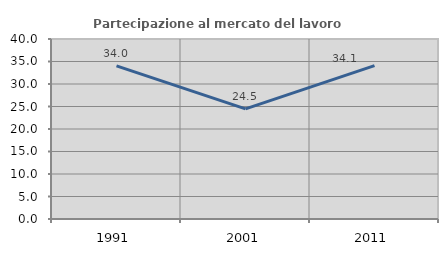
| Category | Partecipazione al mercato del lavoro  femminile |
|---|---|
| 1991.0 | 34.03 |
| 2001.0 | 24.458 |
| 2011.0 | 34.076 |